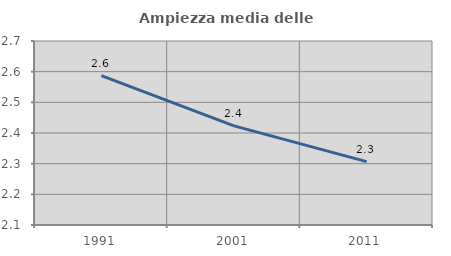
| Category | Ampiezza media delle famiglie |
|---|---|
| 1991.0 | 2.587 |
| 2001.0 | 2.423 |
| 2011.0 | 2.307 |